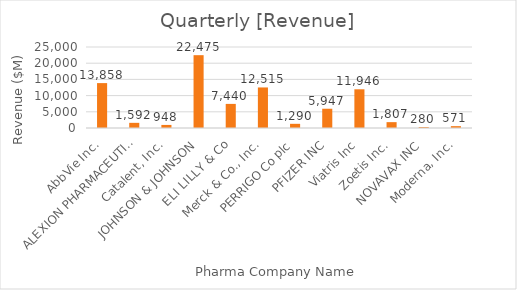
| Category | [Revenue] |
|---|---|
| AbbVie Inc. | 13858 |
| ALEXION PHARMACEUTICALS, INC. | 1591.8 |
| Catalent, Inc. | 947.6 |
| JOHNSON & JOHNSON | 22475 |
| ELI LILLY & Co | 7440 |
| Merck & Co., Inc. | 12515 |
| PERRIGO Co plc | 1289.5 |
| PFIZER INC | 5947 |
| Viatris Inc | 11946 |
| Zoetis Inc. | 1807 |
| NOVAVAX INC | 279.659 |
| Moderna, Inc. | 570.745 |